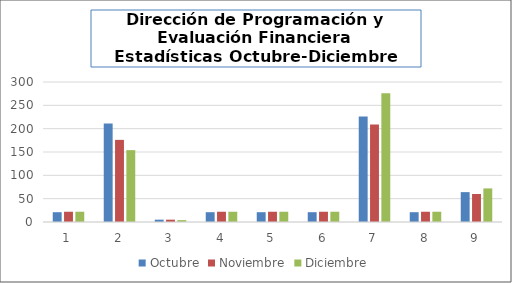
| Category | Octubre | Noviembre | Diciembre |
|---|---|---|---|
| 0 | 21 | 22 | 22 |
| 1 | 211 | 176 | 154 |
| 2 | 5 | 5 | 4 |
| 3 | 21 | 22 | 22 |
| 4 | 21 | 22 | 22 |
| 5 | 21 | 22 | 22 |
| 6 | 226 | 209 | 276 |
| 7 | 21 | 22 | 22 |
| 8 | 64 | 60 | 72 |